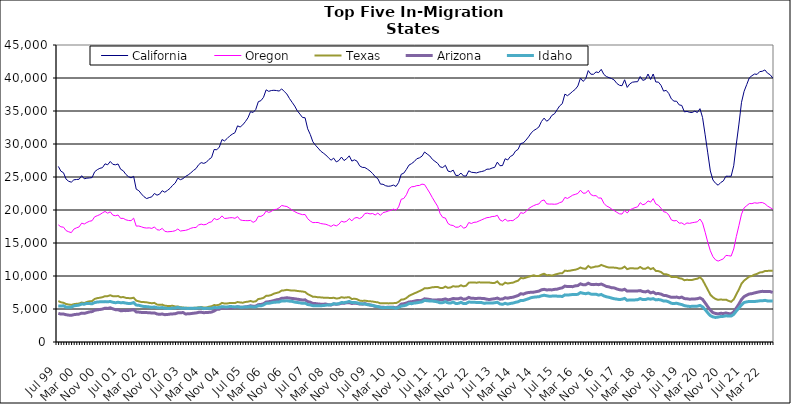
| Category | California | Oregon | Texas | Arizona | Idaho |
|---|---|---|---|---|---|
| Jul 99 | 26605 | 17749 | 6209 | 4339 | 5471 |
| Aug 99 | 25882 | 17447 | 6022 | 4228 | 5444 |
| Sep 99 | 25644 | 17401 | 5941 | 4237 | 5488 |
| Oct 99 | 24669 | 16875 | 5751 | 4134 | 5279 |
| Nov 99 | 24353 | 16701 | 5680 | 4073 | 5260 |
| Dec 99 | 24218 | 16570 | 5619 | 4042 | 5269 |
| Jan 00 | 24574 | 17109 | 5736 | 4142 | 5485 |
| Feb 00 | 24620 | 17295 | 5789 | 4192 | 5530 |
| Mar 00 | 24655 | 17436 | 5826 | 4226 | 5590 |
| Apr 00 | 25195 | 18009 | 5980 | 4375 | 5748 |
| May 00 | 24730 | 17875 | 5897 | 4337 | 5729 |
| Jun 00 | 24825 | 18113 | 6070 | 4444 | 5853 |
| Jul 00 | 24857 | 18294 | 6163 | 4555 | 5824 |
| Aug 00 | 24913 | 18376 | 6199 | 4603 | 5788 |
| Sep 00 | 25792 | 18971 | 6529 | 4804 | 5976 |
| Oct 00 | 26106 | 19135 | 6643 | 4870 | 6058 |
| Nov 00 | 26315 | 19306 | 6705 | 4926 | 6085 |
| Dec 00 | 26415 | 19570 | 6793 | 4991 | 6096 |
| Jan 01 | 26995 | 19781 | 6942 | 5122 | 6119 |
| Feb 01 | 26851 | 19519 | 6948 | 5089 | 6090 |
| Mar 01 | 27352 | 19720 | 7080 | 5180 | 6143 |
| Apr 01 | 26918 | 19221 | 6943 | 5020 | 6020 |
| May 01 | 26848 | 19126 | 6924 | 4899 | 5950 |
| Jun 01 | 26974 | 19241 | 6959 | 4895 | 6019 |
| Jul 01 | 26172 | 18725 | 6778 | 4737 | 5951 |
| Aug 01 | 25943 | 18736 | 6810 | 4757 | 5973 |
| Sep 01 | 25399 | 18514 | 6688 | 4753 | 5895 |
| Oct 01 | 25050 | 18415 | 6650 | 4780 | 5833 |
| Nov 01 | 24873 | 18381 | 6631 | 4826 | 5850 |
| Dec 01 | 25099 | 18765 | 6708 | 4898 | 5969 |
| Jan 02 | 23158 | 17561 | 6261 | 4560 | 5595 |
| Feb 02 | 22926 | 17573 | 6162 | 4531 | 5560 |
| Mar 02 | 22433 | 17452 | 6052 | 4481 | 5458 |
| Apr 02 | 22012 | 17314 | 6046 | 4458 | 5380 |
| May 02 | 21733 | 17267 | 6007 | 4452 | 5358 |
| Jun 02 | 21876 | 17298 | 5933 | 4444 | 5315 |
| Jul 02 | 21997 | 17209 | 5873 | 4383 | 5243 |
| Aug 02 | 22507 | 17436 | 5929 | 4407 | 5315 |
| Sep 02 | 22244 | 17010 | 5672 | 4248 | 5192 |
| Oct 02 | 22406 | 16952 | 5625 | 4191 | 5167 |
| Nov 02 | 22922 | 17223 | 5663 | 4242 | 5221 |
| Dec 02 | 22693 | 16770 | 5499 | 4142 | 5120 |
| Jan 03 | 22964 | 16694 | 5463 | 4166 | 5089 |
| Feb 03 | 23276 | 16727 | 5461 | 4226 | 5077 |
| Mar 03 | 23736 | 16766 | 5486 | 4251 | 5145 |
| Apr 03 | 24079 | 16859 | 5389 | 4289 | 5145 |
| May 03 | 24821 | 17117 | 5378 | 4415 | 5254 |
| Jun 03 | 24592 | 16812 | 5273 | 4426 | 5135 |
| Jul 03 | 24754 | 16875 | 5226 | 4466 | 5124 |
| Aug 03 | 25092 | 16922 | 5181 | 4244 | 5100 |
| Sep 03 | 25316 | 17036 | 5181 | 4279 | 5086 |
| Oct 03 | 25622 | 17228 | 5139 | 4301 | 5110 |
| Nov 03 | 25984 | 17335 | 5175 | 4362 | 5091 |
| Dec 03 | 26269 | 17350 | 5189 | 4396 | 5113 |
| Jan 04 | 26852 | 17734 | 5255 | 4492 | 5152 |
| Feb 04 | 27184 | 17860 | 5301 | 4502 | 5183 |
| Mar 04 | 27062 | 17757 | 5227 | 4443 | 5056 |
| Apr 04 | 27238 | 17840 | 5227 | 4461 | 5104 |
| May 04 | 27671 | 18113 | 5345 | 4493 | 5095 |
| Jun 04 | 27949 | 18201 | 5416 | 4532 | 5103 |
| Jul 04 | 29172 | 18727 | 5597 | 4697 | 5231 |
| Aug 04 | 29122 | 18529 | 5561 | 4945 | 5197 |
| Sep 04 | 29542 | 18678 | 5656 | 4976 | 5237 |
| Oct 04 | 30674 | 19108 | 5922 | 5188 | 5363 |
| Nov 04 | 30472 | 18716 | 5823 | 5106 | 5321 |
| Dec 04 | 30831 | 18755 | 5838 | 5135 | 5312 |
| Jan 05 | 31224 | 18823 | 5906 | 5155 | 5374 |
| Feb 05 | 31495 | 18842 | 5898 | 5168 | 5357 |
| Mar 05 | 31714 | 18738 | 5894 | 5212 | 5313 |
| Apr 05 | 32750 | 18998 | 6060 | 5340 | 5350 |
| May 05 | 32575 | 18504 | 5989 | 5269 | 5276 |
| Jun 05 | 32898 | 18414 | 5954 | 5252 | 5271 |
| Jul 05 | 33384 | 18395 | 6062 | 5322 | 5322 |
| Aug 05 | 33964 | 18381 | 6113 | 5375 | 5316 |
| Sep 05 | 34897 | 18426 | 6206 | 5493 | 5362 |
| Oct 05 | 34780 | 18132 | 6100 | 5408 | 5308 |
| Nov 05 | 35223 | 18332 | 6162 | 5434 | 5314 |
| Dec 05 | 36415 | 19047 | 6508 | 5658 | 5487 |
| Jan 06 | 36567 | 19032 | 6576 | 5688 | 5480 |
| Feb 06 | 37074 | 19257 | 6692 | 5792 | 5616 |
| Mar 06 | 38207 | 19845 | 6993 | 6052 | 5850 |
| Apr 06 | 37976 | 19637 | 7024 | 6101 | 5864 |
| May 06 | 38099 | 19781 | 7114 | 6178 | 5943 |
| Jun 06 | 38141 | 20061 | 7331 | 6276 | 6018 |
| Jul 06 | 38097 | 20111 | 7431 | 6399 | 6046 |
| Aug 06 | 38021 | 20333 | 7542 | 6450 | 6064 |
| Sep 06 | 38349 | 20686 | 7798 | 6627 | 6232 |
| Oct 06 | 37947 | 20591 | 7825 | 6647 | 6216 |
| Nov 06 | 37565 | 20526 | 7907 | 6707 | 6244 |
| Dec 06 | 36884 | 20272 | 7840 | 6648 | 6192 |
| Jan 07 | 36321 | 19984 | 7789 | 6597 | 6151 |
| Feb 07 | 35752 | 19752 | 7799 | 6554 | 6048 |
| Mar 07 | 35025 | 19547 | 7737 | 6487 | 5989 |
| Apr 07 | 34534 | 19412 | 7685 | 6430 | 5937 |
| May 07 | 34022 | 19296 | 7654 | 6353 | 5858 |
| Jun 07 | 33974 | 19318 | 7577 | 6390 | 5886 |
| Jul 07 | 32298 | 18677 | 7250 | 6117 | 5682 |
| Aug 07 | 31436 | 18322 | 7070 | 6034 | 5617 |
| Sep 07 | 30331 | 18087 | 6853 | 5847 | 5500 |
| Oct 07 | 29813 | 18108 | 6839 | 5821 | 5489 |
| Nov 07 | 29384 | 18105 | 6777 | 5769 | 5481 |
| Dec 07 | 28923 | 17949 | 6760 | 5733 | 5499 |
| Jan 08 | 28627 | 17890 | 6721 | 5732 | 5521 |
| Feb 08 | 28328 | 17834 | 6719 | 5749 | 5579 |
| Mar 08 | 27911 | 17680 | 6690 | 5650 | 5614 |
| Apr 08 | 27543 | 17512 | 6656 | 5612 | 5635 |
| May 08 | 27856 | 17754 | 6705 | 5774 | 5798 |
| Jun 08 | 27287 | 17589 | 6593 | 5717 | 5745 |
| Jul 08 | 27495 | 17834 | 6623 | 5761 | 5807 |
| Aug 08 | 28018 | 18309 | 6789 | 5867 | 5982 |
| Sep-08 | 27491 | 18164 | 6708 | 5864 | 5954 |
| Oct 08 | 27771 | 18291 | 6755 | 5942 | 6032 |
| Nov 08 | 28206 | 18706 | 6787 | 5970 | 6150 |
| Dec 08 | 27408 | 18353 | 6505 | 5832 | 5975 |
| Jan 09 | 27601 | 18778 | 6569 | 5890 | 5995 |
| Feb 09 | 27394 | 18863 | 6483 | 5845 | 5936 |
| Mar 09 | 26690 | 18694 | 6273 | 5751 | 5806 |
| Apr 09 | 26461 | 18943 | 6222 | 5735 | 5777 |
| May 09 | 26435 | 19470 | 6272 | 5819 | 5767 |
| Jun 09 | 26187 | 19522 | 6199 | 5700 | 5649 |
| Jul 09 | 25906 | 19408 | 6171 | 5603 | 5617 |
| Aug 09 | 25525 | 19469 | 6128 | 5533 | 5540 |
| Sep 09 | 25050 | 19249 | 6059 | 5405 | 5437 |
| Oct 09 | 24741 | 19529 | 6004 | 5349 | 5369 |
| Nov 09 | 23928 | 19187 | 5854 | 5271 | 5248 |
| Dec 09 | 23899 | 19607 | 5886 | 5261 | 5195 |
| Jan 10 | 23676 | 19703 | 5881 | 5232 | 5234 |
| Feb 10 | 23592 | 19845 | 5850 | 5272 | 5236 |
| Mar 10 | 23634 | 19946 | 5864 | 5278 | 5219 |
| Apr 10 | 23774 | 20134 | 5889 | 5257 | 5201 |
| May 10 | 23567 | 19966 | 5897 | 5172 | 5105 |
| Jun 10 | 24166 | 20464 | 6087 | 5356 | 5237 |
| Jul 10 | 25410 | 21627 | 6417 | 5742 | 5452 |
| Aug 10 | 25586 | 21744 | 6465 | 5797 | 5491 |
| Sep 10 | 26150 | 22314 | 6667 | 5907 | 5609 |
| Oct 10 | 26807 | 23219 | 6986 | 6070 | 5831 |
| Nov 10 | 27033 | 23520 | 7179 | 6100 | 5810 |
| Dec 10 | 27332 | 23551 | 7361 | 6182 | 5898 |
| Jan 11 | 27769 | 23697 | 7525 | 6276 | 5938 |
| Feb 11 | 27898 | 23718 | 7708 | 6267 | 6016 |
| Mar 11 | 28155 | 23921 | 7890 | 6330 | 6081 |
| Apr 11 | 28790 | 23847 | 8146 | 6544 | 6305 |
| May 11 | 28471 | 23215 | 8131 | 6502 | 6248 |
| Jun 11 | 28191 | 22580 | 8199 | 6445 | 6217 |
| Jul 11 | 27678 | 21867 | 8291 | 6368 | 6202 |
| Aug 11 | 27372 | 21203 | 8321 | 6356 | 6146 |
| Sep 11 | 27082 | 20570 | 8341 | 6387 | 6075 |
| Oct 11 | 26528 | 19442 | 8191 | 6402 | 5932 |
| Nov 11 | 26440 | 18872 | 8176 | 6426 | 5968 |
| Dec 11 | 26770 | 18784 | 8401 | 6533 | 6106 |
| Jan 12 | 25901 | 17963 | 8202 | 6390 | 5933 |
| Feb 12 | 25796 | 17718 | 8266 | 6456 | 5900 |
| Mar 12 | 26042 | 17647 | 8456 | 6600 | 6054 |
| Apr 12 | 25239 | 17386 | 8388 | 6534 | 5838 |
| May 12 | 25238 | 17407 | 8401 | 6558 | 5854 |
| Jun 12 | 25593 | 17673 | 8594 | 6669 | 6009 |
| Jul 12 | 25155 | 17237 | 8432 | 6474 | 5817 |
| Aug 12 | 25146 | 17391 | 8536 | 6539 | 5842 |
| Sep 12 | 25942 | 18102 | 8989 | 6759 | 6061 |
| Oct 12 | 25718 | 17953 | 9012 | 6618 | 6027 |
| Nov 12 | 25677 | 18134 | 9032 | 6611 | 6009 |
| Dec 12 | 25619 | 18166 | 8981 | 6601 | 5999 |
| Jan 13 | 25757 | 18344 | 9051 | 6627 | 5989 |
| Feb-13 | 25830 | 18512 | 9001 | 6606 | 5968 |
| Mar-13 | 25940 | 18689 | 9021 | 6577 | 5853 |
| Apr 13 | 26187 | 18844 | 9013 | 6478 | 5925 |
| May 13 | 26192 | 18884 | 9003 | 6431 | 5924 |
| Jun-13 | 26362 | 19013 | 8948 | 6508 | 5896 |
| Jul 13 | 26467 | 19037 | 8958 | 6559 | 5948 |
| Aug 13 | 27253 | 19198 | 9174 | 6655 | 6020 |
| Sep 13 | 26711 | 18501 | 8747 | 6489 | 5775 |
| Oct 13 | 26733 | 18301 | 8681 | 6511 | 5711 |
| Nov 13 | 27767 | 18620 | 8989 | 6709 | 5860 |
| Dec 13 | 27583 | 18320 | 8863 | 6637 | 5740 |
| Jan 14 | 28107 | 18409 | 8939 | 6735 | 5843 |
| Feb-14 | 28313 | 18383 | 8989 | 6779 | 5893 |
| Mar 14 | 28934 | 18696 | 9160 | 6918 | 6015 |
| Apr 14 | 29192 | 18946 | 9291 | 7036 | 6099 |
| May 14 | 30069 | 19603 | 9701 | 7314 | 6304 |
| Jun 14 | 30163 | 19487 | 9641 | 7252 | 6293 |
| Jul-14 | 30587 | 19754 | 9752 | 7415 | 6427 |
| Aug-14 | 31074 | 20201 | 9882 | 7499 | 6557 |
| Sep 14 | 31656 | 20459 | 9997 | 7536 | 6719 |
| Oct 14 | 32037 | 20663 | 10109 | 7555 | 6786 |
| Nov 14 | 32278 | 20825 | 9992 | 7628 | 6831 |
| Dec 14 | 32578 | 20918 | 10006 | 7705 | 6860 |
| Jan 15 | 33414 | 21396 | 10213 | 7906 | 7000 |
| Feb 15 | 33922 | 21518 | 10337 | 7982 | 7083 |
| Mar 15 | 33447 | 20942 | 10122 | 7891 | 7006 |
| Apr-15 | 33731 | 20893 | 10138 | 7906 | 6931 |
| May 15 | 34343 | 20902 | 10053 | 7895 | 6952 |
| Jun-15 | 34572 | 20870 | 10192 | 7973 | 6966 |
| Jul 15 | 35185 | 20916 | 10303 | 8000 | 6949 |
| Aug 15 | 35780 | 21115 | 10399 | 8126 | 6938 |
| Sep 15 | 36109 | 21246 | 10428 | 8207 | 6896 |
| Oct 15 | 37555 | 21908 | 10813 | 8477 | 7140 |
| Nov 15 | 37319 | 21750 | 10763 | 8390 | 7112 |
| Dec 15 | 37624 | 21990 | 10807 | 8395 | 7149 |
| Jan 16 | 37978 | 22248 | 10892 | 8388 | 7201 |
| Feb 16 | 38285 | 22369 | 10951 | 8508 | 7192 |
| Mar 16 | 38792 | 22506 | 11075 | 8547 | 7226 |
| Apr 16 | 39994 | 22999 | 11286 | 8815 | 7487 |
| May 16 | 39488 | 22548 | 11132 | 8673 | 7382 |
| Jun 16 | 39864 | 22556 | 11100 | 8682 | 7315 |
| Jul 16 | 41123 | 22989 | 11516 | 8903 | 7420 |
| Aug 16 | 40573 | 22333 | 11251 | 8731 | 7261 |
| Sep 16 | 40560 | 22162 | 11340 | 8692 | 7216 |
| Oct 16 | 40923 | 22172 | 11456 | 8742 | 7233 |
| Nov 16 | 40817 | 21818 | 11459 | 8685 | 7101 |
| Dec 16 | 41311 | 21815 | 11681 | 8783 | 7203 |
| Jan 17 | 40543 | 21029 | 11524 | 8609 | 6982 |
| Feb 17 | 40218 | 20613 | 11385 | 8416 | 6852 |
| Mar 17 | 40052 | 20425 | 11276 | 8354 | 6775 |
| Apr 17 | 39913 | 20147 | 11297 | 8218 | 6653 |
| May 17 | 39695 | 19910 | 11265 | 8196 | 6552 |
| Jun 17 | 39177 | 19650 | 11225 | 8034 | 6500 |
| Jul 17 | 38901 | 19419 | 11115 | 7923 | 6429 |
| Aug 17 | 38827 | 19389 | 11168 | 7867 | 6479 |
| Sep 17 | 39736 | 19936 | 11426 | 7991 | 6609 |
| Oct 17 | 38576 | 19547 | 11041 | 7708 | 6315 |
| Nov 17 | 39108 | 20013 | 11158 | 7746 | 6381 |
| Dec 17 | 39359 | 20202 | 11185 | 7743 | 6366 |
| Jan 18 | 39420 | 20362 | 11118 | 7736 | 6380 |
| Feb 18 | 39440 | 20476 | 11128 | 7741 | 6407 |
| Mar 18 | 40218 | 21106 | 11362 | 7789 | 6578 |
| Apr 18 | 39637 | 20788 | 11111 | 7642 | 6423 |
| May 18 | 39777 | 20933 | 11097 | 7591 | 6430 |
| Jun 18 | 40602 | 21381 | 11317 | 7721 | 6554 |
| Jul 18 | 39767 | 21189 | 11038 | 7445 | 6489 |
| Aug 18 | 40608 | 21729 | 11200 | 7560 | 6569 |
| Sep 18 | 39395 | 20916 | 10772 | 7318 | 6383 |
| Oct 18 | 39383 | 20724 | 10740 | 7344 | 6429 |
| Nov 18 | 38891 | 20265 | 10605 | 7255 | 6365 |
| Dec 18 | 38013 | 19741 | 10292 | 7069 | 6205 |
| Jan 19 | 38130 | 19643 | 10261 | 7032 | 6203 |
| Feb 19 | 37658 | 19237 | 10132 | 6892 | 6073 |
| Mar 19 | 36831 | 18492 | 9848 | 6766 | 5863 |
| Apr 19 | 36492 | 18349 | 9839 | 6763 | 5827 |
| May 19 | 36481 | 18407 | 9867 | 6809 | 5873 |
| Jun 19 | 35925 | 17998 | 9661 | 6698 | 5761 |
| Jul 19 | 35843 | 18049 | 9598 | 6800 | 5673 |
| Aug 19 | 34870 | 17785 | 9361 | 6577 | 5512 |
| Sep 19 | 34945 | 18038 | 9428 | 6547 | 5437 |
| Oct 19 | 34802 | 17977 | 9385 | 6483 | 5390 |
| Nov 19 | 34775 | 18072 | 9403 | 6511 | 5401 |
| Dec 19 | 34976 | 18140 | 9518 | 6521 | 5419 |
| Jan 20 | 34774 | 18209 | 9594 | 6561 | 5434 |
| Feb 20 | 35352 | 18632 | 9804 | 6682 | 5543 |
| Mar 20 | 34013 | 18041 | 9411 | 6464 | 5330 |
| Apr 20 | 31385 | 16629 | 8666 | 5922 | 4906 |
| May 20 | 28657 | 15123 | 7927 | 5355 | 4419 |
| Jun 20 | 25915 | 13817 | 7164 | 4815 | 3992 |
| Jul 20 | 24545 | 12926 | 6776 | 4457 | 3810 |
| Aug 20 | 24048 | 12443 | 6521 | 4326 | 3720 |
| Sep 20 | 23756 | 12258 | 6386 | 4266 | 3784 |
| Oct 20 | 24166 | 12429 | 6452 | 4347 | 3861 |
| Nov 20 | 24404 | 12597 | 6386 | 4324 | 3883 |
| Dec 20 | 25120 | 13122 | 6420 | 4394 | 3974 |
| Jan 21 | 25111 | 13080 | 6236 | 4304 | 3924 |
| Feb 21 | 25114 | 13015 | 6094 | 4260 | 3930 |
| Mar 21 | 26701 | 14096 | 6455 | 4567 | 4185 |
| Apr 21 | 29998 | 15978 | 7222 | 5164 | 4697 |
| May 21 | 33020 | 17641 | 7969 | 5748 | 5148 |
| Jun 21 | 36320 | 19369 | 8840 | 6450 | 5628 |
| Jul 21 | 37989 | 20320 | 9306 | 6877 | 5984 |
| Aug 21 | 39007 | 20657 | 9615 | 7094 | 6084 |
| Sep 21 | 40023 | 20974 | 9914 | 7277 | 6151 |
| Oct 21 | 40348 | 20966 | 10003 | 7327 | 6140 |
| Nov 21 | 40599 | 21096 | 10203 | 7437 | 6136 |
| Dec 21 | 40548 | 21032 | 10328 | 7532 | 6183 |
| Jan 22 | 40967 | 21106 | 10535 | 7618 | 6237 |
| Feb 22 | 41019 | 21125 | 10579 | 7673 | 6236 |
| Mar 22 | 41220 | 20949 | 10751 | 7660 | 6310 |
| Apr 22 | 40730 | 20602 | 10772 | 7661 | 6221 |
| May 22 | 40504 | 20370 | 10792 | 7636 | 6210 |
| Jun 22 | 40013 | 20127 | 10802 | 7504 | 6199 |